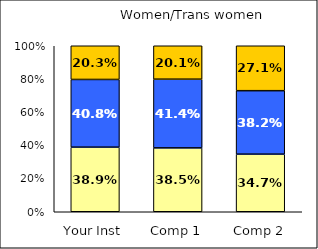
| Category | Low Civic Engagement | Average Civic Engagement | High Civic Engagement |
|---|---|---|---|
| Your Inst | 0.389 | 0.408 | 0.203 |
| Comp 1 | 0.385 | 0.414 | 0.201 |
| Comp 2 | 0.347 | 0.382 | 0.271 |